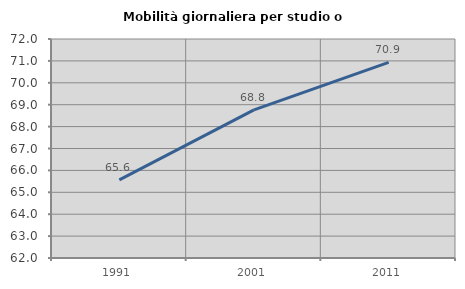
| Category | Mobilità giornaliera per studio o lavoro |
|---|---|
| 1991.0 | 65.565 |
| 2001.0 | 68.766 |
| 2011.0 | 70.929 |